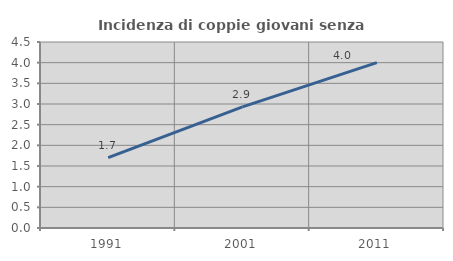
| Category | Incidenza di coppie giovani senza figli |
|---|---|
| 1991.0 | 1.702 |
| 2001.0 | 2.929 |
| 2011.0 | 4 |